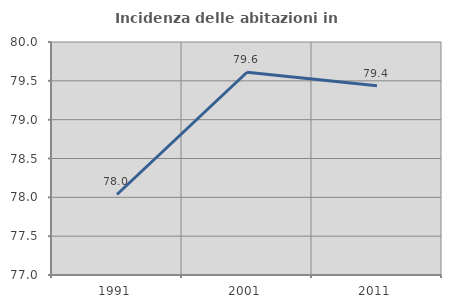
| Category | Incidenza delle abitazioni in proprietà  |
|---|---|
| 1991.0 | 78.037 |
| 2001.0 | 79.611 |
| 2011.0 | 79.436 |